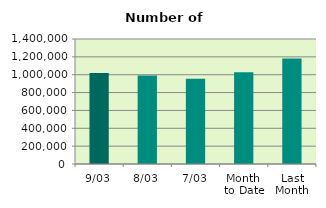
| Category | Series 0 |
|---|---|
| 9/03 | 1019920 |
| 8/03 | 991048 |
| 7/03 | 954812 |
| Month 
to Date | 1027507.429 |
| Last
Month | 1180310.4 |